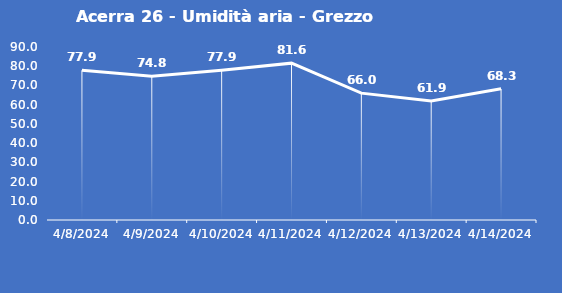
| Category | Acerra 26 - Umidità aria - Grezzo (%) |
|---|---|
| 4/8/24 | 77.9 |
| 4/9/24 | 74.8 |
| 4/10/24 | 77.9 |
| 4/11/24 | 81.6 |
| 4/12/24 | 66 |
| 4/13/24 | 61.9 |
| 4/14/24 | 68.3 |